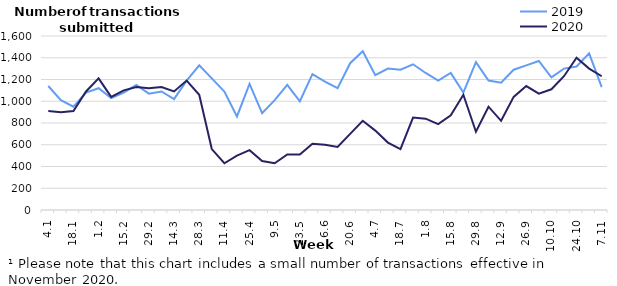
| Category | 2019 | 2020 |
|---|---|---|
| 43834.0 | 1140 | 910 |
| 43841.0 | 1010 | 900 |
| 43848.0 | 950 | 910 |
| 43855.0 | 1080 | 1090 |
| 43862.0 | 1120 | 1210 |
| 43869.0 | 1030 | 1040 |
| 43876.0 | 1080 | 1100 |
| 43883.0 | 1150 | 1130 |
| 43890.0 | 1070 | 1120 |
| 43897.0 | 1090 | 1130 |
| 43904.0 | 1020 | 1090 |
| 43911.0 | 1190 | 1190 |
| 43918.0 | 1330 | 1060 |
| 43925.0 | 1210 | 560 |
| 43932.0 | 1090 | 430 |
| 43939.0 | 860 | 500 |
| 43946.0 | 1160 | 550 |
| 43953.0 | 890 | 450 |
| 43960.0 | 1010 | 430 |
| 43967.0 | 1150 | 510 |
| 43974.0 | 1000 | 510 |
| 43981.0 | 1250 | 610 |
| 43988.0 | 1180 | 600 |
| 43995.0 | 1120 | 580 |
| 44002.0 | 1350 | 700 |
| 44009.0 | 1460 | 820 |
| 44016.0 | 1240 | 730 |
| 44023.0 | 1300 | 620 |
| 44030.0 | 1290 | 560 |
| 44037.0 | 1340 | 850 |
| 44044.0 | 1260 | 840 |
| 44051.0 | 1190 | 790 |
| 44058.0 | 1260 | 870 |
| 44065.0 | 1080 | 1060 |
| 44072.0 | 1360 | 720 |
| 44079.0 | 1190 | 950 |
| 44086.0 | 1170 | 820 |
| 44093.0 | 1290 | 1040 |
| 44100.0 | 1330 | 1140 |
| 44107.0 | 1370 | 1070 |
| 44114.0 | 1220 | 1110 |
| 44121.0 | 1300 | 1230 |
| 44128.0 | 1320 | 1400 |
| 44135.0 | 1440 | 1300 |
| 44142.0 | 1130 | 1230 |